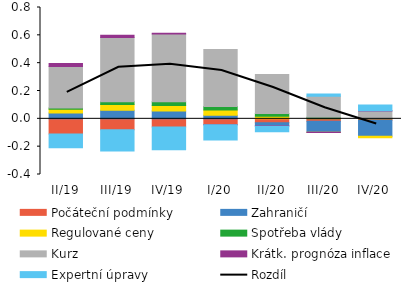
| Category | Počáteční podmínky | Zahraničí | Regulované ceny | Spotřeba vlády | Kurz | Krátk. prognóza inflace | Expertní úpravy |
|---|---|---|---|---|---|---|---|
| II/19 | -0.109 | 0.041 | 0.028 | 0.009 | 0.298 | 0.022 | -0.099 |
| III/19 | -0.079 | 0.062 | 0.041 | 0.02 | 0.462 | 0.016 | -0.152 |
| IV/19 | -0.059 | 0.057 | 0.039 | 0.027 | 0.487 | 0.005 | -0.163 |
| I/20 | -0.042 | 0.026 | 0.037 | 0.026 | 0.41 | -0.002 | -0.108 |
| II/20 | -0.028 | -0.022 | 0.018 | 0.019 | 0.281 | -0.003 | -0.04 |
| III/20 | -0.018 | -0.079 | 0 | 0.011 | 0.152 | -0.001 | 0.015 |
| IV/20 | -0.01 | -0.115 | -0.011 | 0.005 | 0.052 | 0.001 | 0.04 |